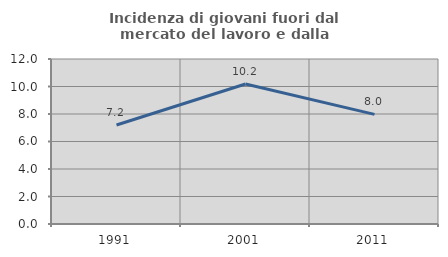
| Category | Incidenza di giovani fuori dal mercato del lavoro e dalla formazione  |
|---|---|
| 1991.0 | 7.197 |
| 2001.0 | 10.185 |
| 2011.0 | 7.972 |